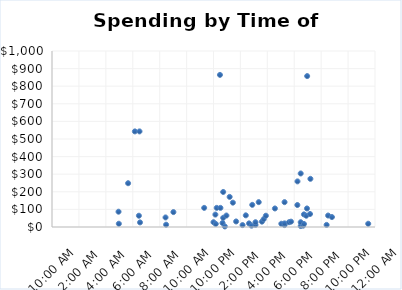
| Category | Final Amount |
|---|---|
| 0.205983657643689 | 86.9 |
| 0.206943045332019 | 18.47 |
| 0.23561808003811 | 248.75 |
| 0.256589420747947 | 543.13 |
| 0.269049974996038 | 64.09 |
| 0.270911413776425 | 543.13 |
| 0.272516333410644 | 26.07 |
| 0.351503948317297 | 54.31 |
| 0.353279167584818 | 13.04 |
| 0.375861682705281 | 84.73 |
| 0.471144966585785 | 108.63 |
| 0.5 | 27.16 |
| 0.505816818770586 | 70.61 |
| 0.506989197258562 | 17.38 |
| 0.51 | 108.63 |
| 0.52 | 864.28 |
| 0.521474523307073 | 108.63 |
| 0.527981025572917 | 22.81 |
| 0.53 | 52.14 |
| 0.53 | 199.02 |
| 0.535041685222246 | 3.26 |
| 0.54 | 65.18 |
| 0.55 | 171.12 |
| 0.56 | 138.26 |
| 0.57 | 31.5 |
| 0.59 | 10.86 |
| 0.6 | 66.26 |
| 0.61 | 20.64 |
| 0.617829034463225 | 7.6 |
| 0.62 | 125.86 |
| 0.63 | 11.95 |
| 0.63 | 27.16 |
| 0.64 | 141.21 |
| 0.65 | 30.42 |
| 0.655462962962963 | 44.54 |
| 0.662188191718139 | 64.09 |
| 0.690138888888889 | 105.37 |
| 0.71 | 18.47 |
| 0.72 | 10.86 |
| 0.72 | 141.21 |
| 0.72 | 20.64 |
| 0.733745475685013 | 27.16 |
| 0.74 | 30.42 |
| 0.759631427755685 | 124.92 |
| 0.76 | 259.16 |
| 0.77 | 5.43 |
| 0.77 | 27.16 |
| 0.77 | 304.15 |
| 0.77755606992794 | 7.6 |
| 0.78 | 17.38 |
| 0.78 | 71.69 |
| 0.787145415827843 | 64.09 |
| 0.78938035831544 | 105.37 |
| 0.79 | 857.46 |
| 0.798877314814815 | 73.87 |
| 0.8 | 273.74 |
| 0.850222481211394 | 11.95 |
| 0.85481775020349 | 65.18 |
| 0.866696350086853 | 56.49 |
| 0.978992566077725 | 18.47 |